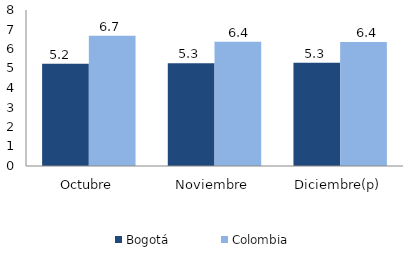
| Category | Bogotá | Colombia |
|---|---|---|
| Octubre | 5.246 | 6.675 |
| Noviembre | 5.273 | 6.377 |
| Diciembre(p) | 5.297 | 6.364 |